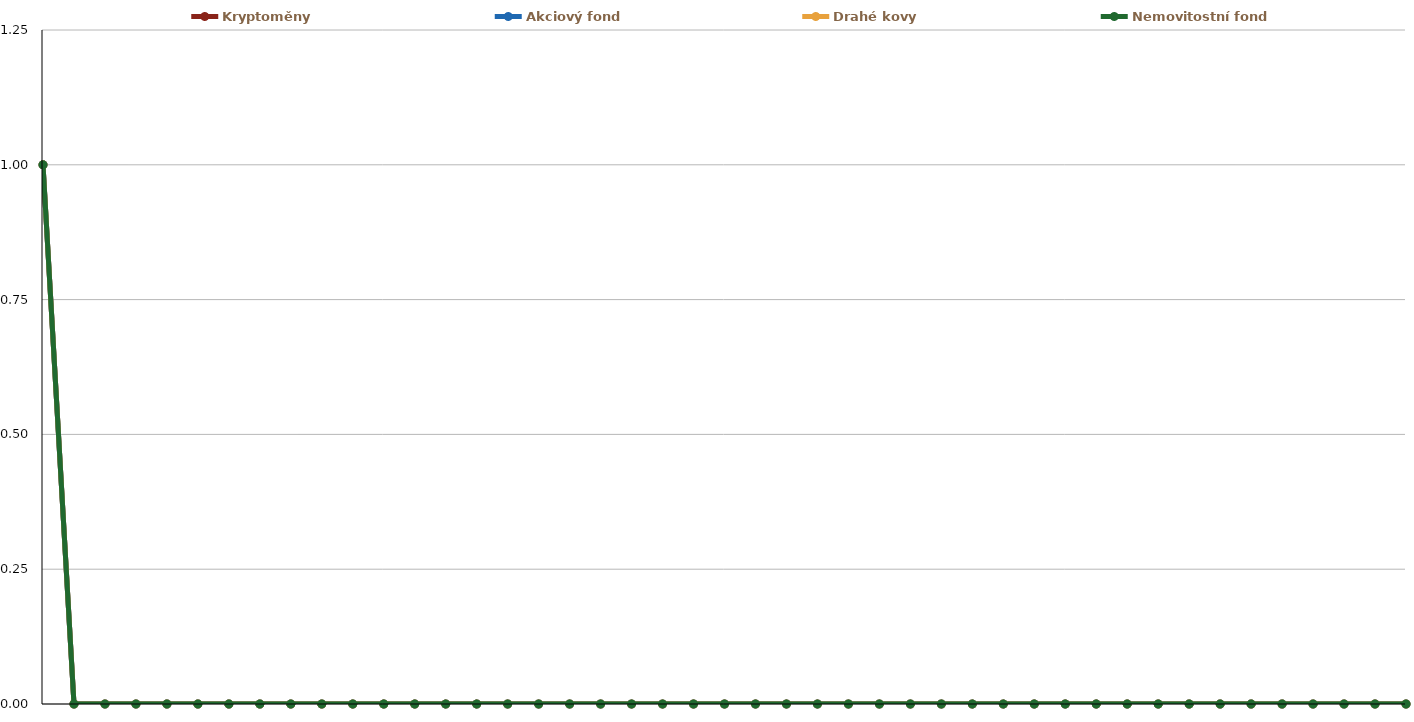
| Category | Kryptoměny | Akciový fond | Drahé kovy | Nemovitostní fond |
|---|---|---|---|---|
| 0 | 1 | 1 | 1 | 1 |
| 1 | 0 | 0 | 0 | 0 |
| 2 | 0 | 0 | 0 | 0 |
| 3 | 0 | 0 | 0 | 0 |
| 4 | 0 | 0 | 0 | 0 |
| 5 | 0 | 0 | 0 | 0 |
| 6 | 0 | 0 | 0 | 0 |
| 7 | 0 | 0 | 0 | 0 |
| 8 | 0 | 0 | 0 | 0 |
| 9 | 0 | 0 | 0 | 0 |
| 10 | 0 | 0 | 0 | 0 |
| 11 | 0 | 0 | 0 | 0 |
| 12 | 0 | 0 | 0 | 0 |
| 13 | 0 | 0 | 0 | 0 |
| 14 | 0 | 0 | 0 | 0 |
| 15 | 0 | 0 | 0 | 0 |
| 16 | 0 | 0 | 0 | 0 |
| 17 | 0 | 0 | 0 | 0 |
| 18 | 0 | 0 | 0 | 0 |
| 19 | 0 | 0 | 0 | 0 |
| 20 | 0 | 0 | 0 | 0 |
| 21 | 0 | 0 | 0 | 0 |
| 22 | 0 | 0 | 0 | 0 |
| 23 | 0 | 0 | 0 | 0 |
| 24 | 0 | 0 | 0 | 0 |
| 25 | 0 | 0 | 0 | 0 |
| 26 | 0 | 0 | 0 | 0 |
| 27 | 0 | 0 | 0 | 0 |
| 28 | 0 | 0 | 0 | 0 |
| 29 | 0 | 0 | 0 | 0 |
| 30 | 0 | 0 | 0 | 0 |
| 31 | 0 | 0 | 0 | 0 |
| 32 | 0 | 0 | 0 | 0 |
| 33 | 0 | 0 | 0 | 0 |
| 34 | 0 | 0 | 0 | 0 |
| 35 | 0 | 0 | 0 | 0 |
| 36 | 0 | 0 | 0 | 0 |
| 37 | 0 | 0 | 0 | 0 |
| 38 | 0 | 0 | 0 | 0 |
| 39 | 0 | 0 | 0 | 0 |
| 40 | 0 | 0 | 0 | 0 |
| 41 | 0 | 0 | 0 | 0 |
| 42 | 0 | 0 | 0 | 0 |
| 43 | 0 | 0 | 0 | 0 |
| 44 | 0 | 0 | 0 | 0 |